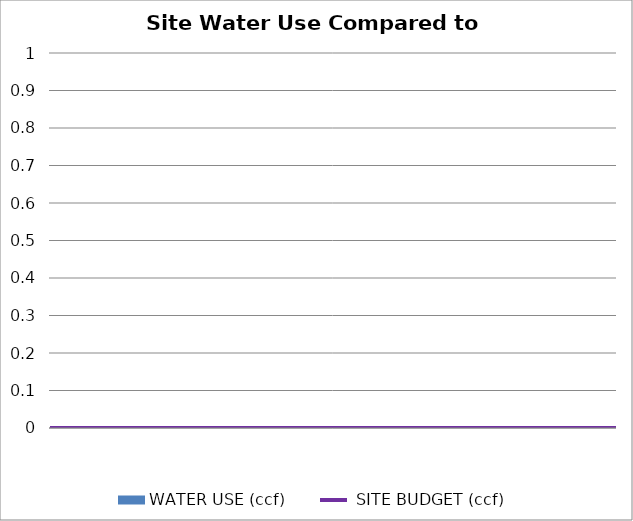
| Category | WATER USE (ccf)  |
|---|---|
|  | 0 |
|  | 0 |
|  | 0 |
|  | 0 |
|  | 0 |
|  | 0 |
|  | 0 |
|  | 0 |
|  | 0 |
|  | 0 |
|  | 0 |
|  | 0 |
|  | 0 |
|  | 0 |
|  | 0 |
|  | 0 |
|  | 0 |
|  | 0 |
|  | 0 |
|  | 0 |
|  | 0 |
|  | 0 |
|  | 0 |
|  | 0 |
|  | 0 |
|  | 0 |
|  | 0 |
|  | 0 |
|  | 0 |
|  | 0 |
|  | 0 |
|  | 0 |
|  | 0 |
|  | 0 |
|  | 0 |
|  | 0 |
|  | 0 |
|  | 0 |
|  | 0 |
|  | 0 |
|  | 0 |
|  | 0 |
|  | 0 |
|  | 0 |
|  | 0 |
|  | 0 |
|  | 0 |
|  | 0 |
|  | 0 |
|  | 0 |
|  | 0 |
|  | 0 |
|  | 0 |
|  | 0 |
|  | 0 |
|  | 0 |
|  | 0 |
|  | 0 |
|  | 0 |
|  | 0 |
|  | 0 |
|  | 0 |
|  | 0 |
|  | 0 |
|  | 0 |
|  | 0 |
|  | 0 |
|  | 0 |
|  | 0 |
|  | 0 |
|  | 0 |
|  | 0 |
|  | 0 |
|  | 0 |
|  | 0 |
|  | 0 |
|  | 0 |
|  | 0 |
|  | 0 |
|  | 0 |
|  | 0 |
|  | 0 |
|  | 0 |
|  | 0 |
|  | 0 |
|  | 0 |
|  | 0 |
|  | 0 |
|  | 0 |
|  | 0 |
|  | 0 |
|  | 0 |
|  | 0 |
|  | 0 |
|  | 0 |
|  | 0 |
|  | 0 |
|  | 0 |
|  | 0 |
|  | 0 |
|  | 0 |
|  | 0 |
|  | 0 |
|  | 0 |
|  | 0 |
|  | 0 |
|  | 0 |
|  | 0 |
|  | 0 |
|  | 0 |
|  | 0 |
|  | 0 |
|  | 0 |
|  | 0 |
|  | 0 |
|  | 0 |
|  | 0 |
|  | 0 |
|  | 0 |
|  | 0 |
|  | 0 |
|  | 0 |
|  | 0 |
|  | 0 |
|  | 0 |
|  | 0 |
|  | 0 |
|  | 0 |
|  | 0 |
|  | 0 |
|  | 0 |
|  | 0 |
|  | 0 |
|  | 0 |
|  | 0 |
|  | 0 |
|  | 0 |
|  | 0 |
|  | 0 |
|  | 0 |
|  | 0 |
|  | 0 |
|  | 0 |
|  | 0 |
|  | 0 |
|  | 0 |
|  | 0 |
|  | 0 |
|  | 0 |
|  | 0 |
|  | 0 |
|  | 0 |
|  | 0 |
|  | 0 |
|  | 0 |
|  | 0 |
|  | 0 |
|  | 0 |
|  | 0 |
|  | 0 |
|  | 0 |
|  | 0 |
|  | 0 |
|  | 0 |
|  | 0 |
|  | 0 |
|  | 0 |
|  | 0 |
|  | 0 |
|  | 0 |
|  | 0 |
|  | 0 |
|  | 0 |
|  | 0 |
|  | 0 |
|  | 0 |
|  | 0 |
|  | 0 |
|  | 0 |
|  | 0 |
|  | 0 |
|  | 0 |
|  | 0 |
|  | 0 |
|  | 0 |
|  | 0 |
|  | 0 |
|  | 0 |
|  | 0 |
|  | 0 |
|  | 0 |
|  | 0 |
|  | 0 |
|  | 0 |
|  | 0 |
|  | 0 |
|  | 0 |
|  | 0 |
|  | 0 |
|  | 0 |
|  | 0 |
|  | 0 |
|  | 0 |
|  | 0 |
|  | 0 |
|  | 0 |
|  | 0 |
|  | 0 |
|  | 0 |
|  | 0 |
|  | 0 |
|  | 0 |
|  | 0 |
|  | 0 |
|  | 0 |
|  | 0 |
|  | 0 |
|  | 0 |
|  | 0 |
|  | 0 |
|  | 0 |
|  | 0 |
|  | 0 |
|  | 0 |
|  | 0 |
|  | 0 |
|  | 0 |
|  | 0 |
|  | 0 |
|  | 0 |
|  | 0 |
|  | 0 |
|  | 0 |
|  | 0 |
|  | 0 |
|  | 0 |
|  | 0 |
|  | 0 |
|  | 0 |
|  | 0 |
|  | 0 |
|  | 0 |
|  | 0 |
|  | 0 |
|  | 0 |
|  | 0 |
|  | 0 |
|  | 0 |
|  | 0 |
|  | 0 |
|  | 0 |
|  | 0 |
|  | 0 |
|  | 0 |
|  | 0 |
|  | 0 |
|  | 0 |
|  | 0 |
|  | 0 |
|  | 0 |
|  | 0 |
|  | 0 |
|  | 0 |
|  | 0 |
|  | 0 |
|  | 0 |
|  | 0 |
|  | 0 |
|  | 0 |
|  | 0 |
|  | 0 |
|  | 0 |
|  | 0 |
|  | 0 |
|  | 0 |
|  | 0 |
|  | 0 |
|  | 0 |
|  | 0 |
|  | 0 |
|  | 0 |
|  | 0 |
|  | 0 |
|  | 0 |
|  | 0 |
|  | 0 |
|  | 0 |
|  | 0 |
|  | 0 |
|  | 0 |
|  | 0 |
|  | 0 |
|  | 0 |
|  | 0 |
|  | 0 |
|  | 0 |
|  | 0 |
|  | 0 |
|  | 0 |
|  | 0 |
|  | 0 |
|  | 0 |
|  | 0 |
|  | 0 |
|  | 0 |
|  | 0 |
|  | 0 |
|  | 0 |
|  | 0 |
|  | 0 |
|  | 0 |
|  | 0 |
|  | 0 |
|  | 0 |
|  | 0 |
|  | 0 |
|  | 0 |
|  | 0 |
|  | 0 |
|  | 0 |
|  | 0 |
|  | 0 |
|  | 0 |
|  | 0 |
|  | 0 |
|  | 0 |
|  | 0 |
|  | 0 |
|  | 0 |
|  | 0 |
|  | 0 |
|  | 0 |
|  | 0 |
|  | 0 |
|  | 0 |
|  | 0 |
|  | 0 |
|  | 0 |
|  | 0 |
|  | 0 |
|  | 0 |
|  | 0 |
|  | 0 |
|  | 0 |
|  | 0 |
|  | 0 |
|  | 0 |
|  | 0 |
|  | 0 |
|  | 0 |
|  | 0 |
|  | 0 |
|  | 0 |
|  | 0 |
|  | 0 |
|  | 0 |
|  | 0 |
|  | 0 |
|  | 0 |
|  | 0 |
|  | 0 |
|  | 0 |
|  | 0 |
|  | 0 |
|  | 0 |
|  | 0 |
|  | 0 |
|  | 0 |
|  | 0 |
|  | 0 |
|  | 0 |
|  | 0 |
|  | 0 |
|  | 0 |
|  | 0 |
|  | 0 |
|  | 0 |
|  | 0 |
|  | 0 |
|  | 0 |
|  | 0 |
|  | 0 |
|  | 0 |
|  | 0 |
|  | 0 |
|  | 0 |
|  | 0 |
|  | 0 |
|  | 0 |
|  | 0 |
|  | 0 |
|  | 0 |
|  | 0 |
|  | 0 |
|  | 0 |
|  | 0 |
|  | 0 |
|  | 0 |
|  | 0 |
|  | 0 |
|  | 0 |
|  | 0 |
|  | 0 |
|  | 0 |
|  | 0 |
|  | 0 |
|  | 0 |
|  | 0 |
|  | 0 |
|  | 0 |
|  | 0 |
|  | 0 |
|  | 0 |
|  | 0 |
|  | 0 |
|  | 0 |
|  | 0 |
|  | 0 |
|  | 0 |
|  | 0 |
|  | 0 |
|  | 0 |
|  | 0 |
|  | 0 |
|  | 0 |
|  | 0 |
|  | 0 |
|  | 0 |
|  | 0 |
|  | 0 |
|  | 0 |
|  | 0 |
|  | 0 |
|  | 0 |
|  | 0 |
|  | 0 |
|  | 0 |
|  | 0 |
|  | 0 |
|  | 0 |
|  | 0 |
|  | 0 |
|  | 0 |
|  | 0 |
|  | 0 |
|  | 0 |
|  | 0 |
|  | 0 |
|  | 0 |
|  | 0 |
|  | 0 |
|  | 0 |
|  | 0 |
|  | 0 |
|  | 0 |
|  | 0 |
|  | 0 |
|  | 0 |
|  | 0 |
|  | 0 |
|  | 0 |
|  | 0 |
|  | 0 |
|  | 0 |
|  | 0 |
|  | 0 |
|  | 0 |
|  | 0 |
|  | 0 |
|  | 0 |
|  | 0 |
|  | 0 |
|  | 0 |
|  | 0 |
|  | 0 |
|  | 0 |
|  | 0 |
|  | 0 |
|  | 0 |
|  | 0 |
|  | 0 |
|  | 0 |
|  | 0 |
|  | 0 |
|  | 0 |
|  | 0 |
|  | 0 |
|  | 0 |
|  | 0 |
|  | 0 |
|  | 0 |
|  | 0 |
|  | 0 |
|  | 0 |
|  | 0 |
|  | 0 |
|  | 0 |
|  | 0 |
|  | 0 |
|  | 0 |
|  | 0 |
|  | 0 |
|  | 0 |
|  | 0 |
|  | 0 |
|  | 0 |
|  | 0 |
|  | 0 |
|  | 0 |
|  | 0 |
|  | 0 |
|  | 0 |
|  | 0 |
|  | 0 |
|  | 0 |
|  | 0 |
|  | 0 |
|  | 0 |
|  | 0 |
|  | 0 |
|  | 0 |
|  | 0 |
|  | 0 |
|  | 0 |
|  | 0 |
|  | 0 |
|  | 0 |
|  | 0 |
|  | 0 |
|  | 0 |
|  | 0 |
|  | 0 |
|  | 0 |
|  | 0 |
|  | 0 |
|  | 0 |
|  | 0 |
|  | 0 |
|  | 0 |
|  | 0 |
|  | 0 |
|  | 0 |
|  | 0 |
|  | 0 |
|  | 0 |
|  | 0 |
|  | 0 |
|  | 0 |
|  | 0 |
|  | 0 |
|  | 0 |
|  | 0 |
|  | 0 |
|  | 0 |
|  | 0 |
|  | 0 |
|  | 0 |
|  | 0 |
|  | 0 |
|  | 0 |
|  | 0 |
|  | 0 |
|  | 0 |
|  | 0 |
|  | 0 |
|  | 0 |
|  | 0 |
|  | 0 |
|  | 0 |
|  | 0 |
|  | 0 |
|  | 0 |
|  | 0 |
|  | 0 |
|  | 0 |
|  | 0 |
|  | 0 |
|  | 0 |
|  | 0 |
|  | 0 |
|  | 0 |
|  | 0 |
|  | 0 |
|  | 0 |
|  | 0 |
|  | 0 |
|  | 0 |
|  | 0 |
|  | 0 |
|  | 0 |
|  | 0 |
|  | 0 |
|  | 0 |
|  | 0 |
|  | 0 |
|  | 0 |
|  | 0 |
|  | 0 |
|  | 0 |
|  | 0 |
|  | 0 |
|  | 0 |
|  | 0 |
|  | 0 |
|  | 0 |
|  | 0 |
|  | 0 |
|  | 0 |
|  | 0 |
|  | 0 |
|  | 0 |
|  | 0 |
|  | 0 |
|  | 0 |
|  | 0 |
|  | 0 |
|  | 0 |
|  | 0 |
|  | 0 |
|  | 0 |
|  | 0 |
|  | 0 |
|  | 0 |
|  | 0 |
|  | 0 |
|  | 0 |
|  | 0 |
|  | 0 |
|  | 0 |
|  | 0 |
|  | 0 |
|  | 0 |
|  | 0 |
|  | 0 |
|  | 0 |
|  | 0 |
|  | 0 |
|  | 0 |
|  | 0 |
|  | 0 |
|  | 0 |
|  | 0 |
|  | 0 |
|  | 0 |
|  | 0 |
|  | 0 |
|  | 0 |
|  | 0 |
|  | 0 |
|  | 0 |
|  | 0 |
|  | 0 |
|  | 0 |
|  | 0 |
|  | 0 |
|  | 0 |
|  | 0 |
|  | 0 |
|  | 0 |
|  | 0 |
|  | 0 |
|  | 0 |
|  | 0 |
|  | 0 |
|  | 0 |
|  | 0 |
|  | 0 |
|  | 0 |
|  | 0 |
|  | 0 |
|  | 0 |
|  | 0 |
|  | 0 |
|  | 0 |
|  | 0 |
|  | 0 |
|  | 0 |
|  | 0 |
|  | 0 |
|  | 0 |
|  | 0 |
|  | 0 |
|  | 0 |
|  | 0 |
|  | 0 |
|  | 0 |
|  | 0 |
|  | 0 |
|  | 0 |
|  | 0 |
|  | 0 |
|  | 0 |
|  | 0 |
|  | 0 |
|  | 0 |
|  | 0 |
|  | 0 |
|  | 0 |
|  | 0 |
|  | 0 |
|  | 0 |
|  | 0 |
|  | 0 |
|  | 0 |
|  | 0 |
|  | 0 |
|  | 0 |
|  | 0 |
|  | 0 |
|  | 0 |
|  | 0 |
|  | 0 |
|  | 0 |
|  | 0 |
|  | 0 |
|  | 0 |
|  | 0 |
|  | 0 |
|  | 0 |
|  | 0 |
|  | 0 |
|  | 0 |
|  | 0 |
|  | 0 |
|  | 0 |
|  | 0 |
|  | 0 |
|  | 0 |
|  | 0 |
|  | 0 |
|  | 0 |
|  | 0 |
|  | 0 |
|  | 0 |
|  | 0 |
|  | 0 |
|  | 0 |
|  | 0 |
|  | 0 |
|  | 0 |
|  | 0 |
|  | 0 |
|  | 0 |
|  | 0 |
|  | 0 |
|  | 0 |
|  | 0 |
|  | 0 |
|  | 0 |
|  | 0 |
|  | 0 |
|  | 0 |
|  | 0 |
|  | 0 |
|  | 0 |
|  | 0 |
|  | 0 |
|  | 0 |
|  | 0 |
|  | 0 |
|  | 0 |
|  | 0 |
|  | 0 |
|  | 0 |
|  | 0 |
|  | 0 |
|  | 0 |
|  | 0 |
|  | 0 |
|  | 0 |
|  | 0 |
|  | 0 |
|  | 0 |
|  | 0 |
|  | 0 |
|  | 0 |
|  | 0 |
|  | 0 |
|  | 0 |
|  | 0 |
|  | 0 |
|  | 0 |
|  | 0 |
|  | 0 |
|  | 0 |
|  | 0 |
|  | 0 |
|  | 0 |
|  | 0 |
|  | 0 |
|  | 0 |
|  | 0 |
|  | 0 |
|  | 0 |
|  | 0 |
|  | 0 |
|  | 0 |
|  | 0 |
|  | 0 |
|  | 0 |
|  | 0 |
|  | 0 |
|  | 0 |
|  | 0 |
|  | 0 |
|  | 0 |
|  | 0 |
|  | 0 |
|  | 0 |
|  | 0 |
|  | 0 |
|  | 0 |
|  | 0 |
|  | 0 |
|  | 0 |
|  | 0 |
|  | 0 |
|  | 0 |
|  | 0 |
|  | 0 |
|  | 0 |
|  | 0 |
|  | 0 |
|  | 0 |
|  | 0 |
|  | 0 |
|  | 0 |
|  | 0 |
|  | 0 |
|  | 0 |
|  | 0 |
|  | 0 |
|  | 0 |
|  | 0 |
|  | 0 |
|  | 0 |
|  | 0 |
|  | 0 |
|  | 0 |
|  | 0 |
|  | 0 |
|  | 0 |
|  | 0 |
|  | 0 |
|  | 0 |
|  | 0 |
|  | 0 |
|  | 0 |
|  | 0 |
|  | 0 |
|  | 0 |
|  | 0 |
|  | 0 |
|  | 0 |
|  | 0 |
|  | 0 |
|  | 0 |
|  | 0 |
|  | 0 |
|  | 0 |
|  | 0 |
|  | 0 |
|  | 0 |
|  | 0 |
|  | 0 |
|  | 0 |
|  | 0 |
|  | 0 |
|  | 0 |
|  | 0 |
|  | 0 |
|  | 0 |
|  | 0 |
|  | 0 |
|  | 0 |
|  | 0 |
|  | 0 |
|  | 0 |
|  | 0 |
|  | 0 |
|  | 0 |
|  | 0 |
|  | 0 |
|  | 0 |
|  | 0 |
|  | 0 |
|  | 0 |
|  | 0 |
|  | 0 |
|  | 0 |
|  | 0 |
|  | 0 |
|  | 0 |
|  | 0 |
|  | 0 |
|  | 0 |
|  | 0 |
|  | 0 |
|  | 0 |
|  | 0 |
|  | 0 |
|  | 0 |
|  | 0 |
|  | 0 |
|  | 0 |
|  | 0 |
|  | 0 |
|  | 0 |
|  | 0 |
|  | 0 |
|  | 0 |
|  | 0 |
|  | 0 |
|  | 0 |
|  | 0 |
|  | 0 |
|  | 0 |
|  | 0 |
|  | 0 |
|  | 0 |
|  | 0 |
|  | 0 |
|  | 0 |
|  | 0 |
|  | 0 |
|  | 0 |
|  | 0 |
|  | 0 |
|  | 0 |
|  | 0 |
|  | 0 |
|  | 0 |
|  | 0 |
|  | 0 |
|  | 0 |
|  | 0 |
|  | 0 |
|  | 0 |
|  | 0 |
|  | 0 |
|  | 0 |
|  | 0 |
|  | 0 |
|  | 0 |
|  | 0 |
|  | 0 |
|  | 0 |
|  | 0 |
|  | 0 |
|  | 0 |
|  | 0 |
|  | 0 |
|  | 0 |
|  | 0 |
|  | 0 |
|  | 0 |
|  | 0 |
|  | 0 |
|  | 0 |
|  | 0 |
|  | 0 |
|  | 0 |
|  | 0 |
|  | 0 |
|  | 0 |
|  | 0 |
|  | 0 |
|  | 0 |
|  | 0 |
|  | 0 |
|  | 0 |
|  | 0 |
|  | 0 |
|  | 0 |
|  | 0 |
|  | 0 |
|  | 0 |
|  | 0 |
|  | 0 |
|  | 0 |
|  | 0 |
|  | 0 |
|  | 0 |
|  | 0 |
|  | 0 |
|  | 0 |
|  | 0 |
|  | 0 |